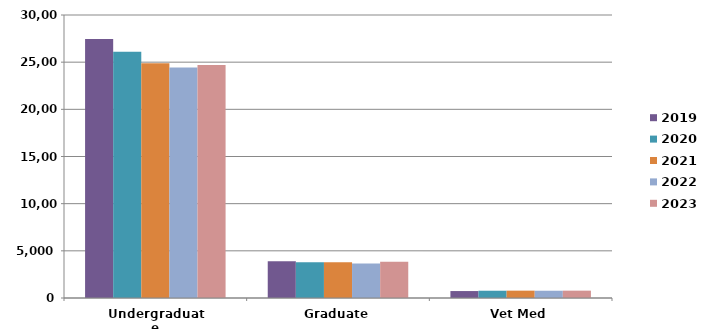
| Category | 2019 | 2020 | 2021 | 2022 | 2023 |
|---|---|---|---|---|---|
| Undergraduate | 27444 | 26094 | 24885.05 | 24441 | 24699 |
| Graduate | 3896 | 3777 | 3793.47 | 3648 | 3851 |
| Vet Med | 737 | 771 | 779.55 | 770 | 779 |